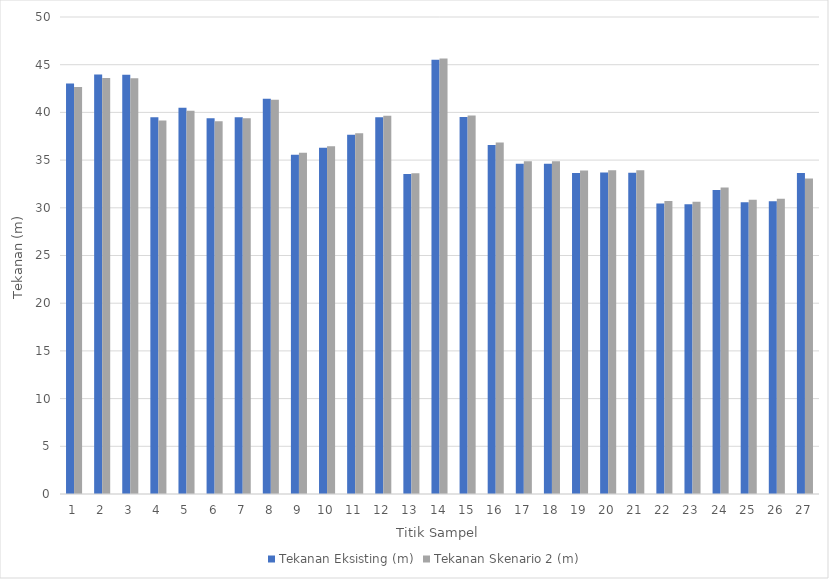
| Category | Tekanan Eksisting (m) | Tekanan Skenario 2 (m) |
|---|---|---|
| 0 | 43.02 | 42.65 |
| 1 | 43.97 | 43.6 |
| 2 | 43.94 | 43.57 |
| 3 | 39.49 | 39.16 |
| 4 | 40.49 | 40.16 |
| 5 | 39.39 | 39.06 |
| 6 | 39.48 | 39.38 |
| 7 | 41.42 | 41.32 |
| 8 | 35.56 | 35.78 |
| 9 | 36.3 | 36.45 |
| 10 | 37.67 | 37.82 |
| 11 | 39.5 | 39.65 |
| 12 | 33.55 | 33.63 |
| 13 | 45.52 | 45.65 |
| 14 | 39.53 | 39.67 |
| 15 | 36.59 | 36.84 |
| 16 | 34.62 | 34.88 |
| 17 | 34.61 | 34.87 |
| 18 | 33.64 | 33.91 |
| 19 | 33.69 | 33.94 |
| 20 | 33.68 | 33.94 |
| 21 | 30.45 | 30.71 |
| 22 | 30.38 | 30.64 |
| 23 | 31.87 | 32.14 |
| 24 | 30.59 | 30.85 |
| 25 | 30.68 | 30.95 |
| 26 | 33.64 | 33.08 |